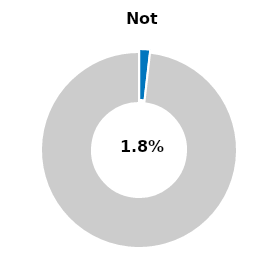
| Category | Series 0 |
|---|---|
| Not passed | 0.018 |
| Other | 0.982 |